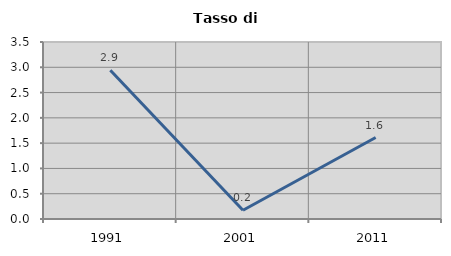
| Category | Tasso di disoccupazione   |
|---|---|
| 1991.0 | 2.941 |
| 2001.0 | 0.174 |
| 2011.0 | 1.611 |